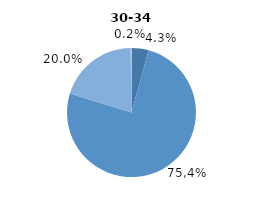
| Category | Series 0 |
|---|---|
| 0 | 4.3 |
| 1 | 75.4 |
| 2 | 20 |
| 3 | 0.2 |